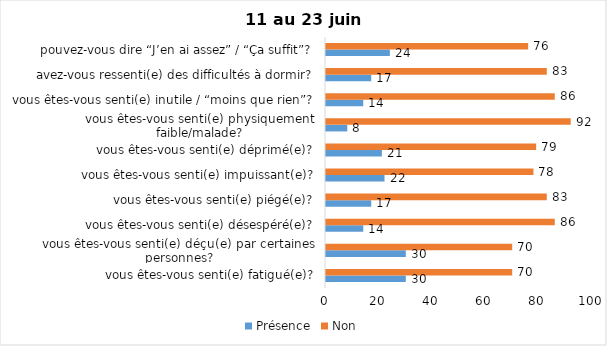
| Category | Présence | Non |
|---|---|---|
| vous êtes-vous senti(e) fatigué(e)? | 30 | 70 |
| vous êtes-vous senti(e) déçu(e) par certaines personnes? | 30 | 70 |
| vous êtes-vous senti(e) désespéré(e)? | 14 | 86 |
| vous êtes-vous senti(e) piégé(e)? | 17 | 83 |
| vous êtes-vous senti(e) impuissant(e)? | 22 | 78 |
| vous êtes-vous senti(e) déprimé(e)? | 21 | 79 |
| vous êtes-vous senti(e) physiquement faible/malade? | 8 | 92 |
| vous êtes-vous senti(e) inutile / “moins que rien”? | 14 | 86 |
| avez-vous ressenti(e) des difficultés à dormir? | 17 | 83 |
| pouvez-vous dire “J’en ai assez” / “Ça suffit”? | 24 | 76 |